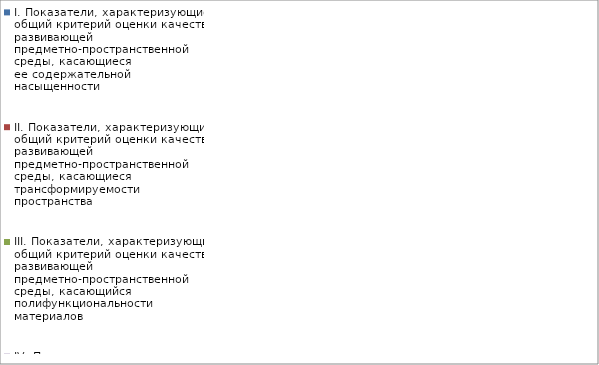
| Category | I. Показатели, характеризующие общий критерий оценки качества развивающей предметно-пространственной среды, касающиеся ее содержательной насыщенности | II. Показатели, характеризующие общий критерий оценки качества развивающей предметно-пространственной среды, касающиеся трансформируемости пространства | III. Показатели, характеризующие общий критерий оценки качества развивающей предметно-пространственной среды, касающийся полифункциональности материалов | IV. Показатели, характеризующие общий критерий оценки качества развивающей предметно-пространственной среды, касающиеся ее вариативности | V. Показатели, характеризующие общий критерий оценки качества развивающей предметно-пространственной среды, касающиеся ее доступности | VI. Показатели, характеризующие общий критерий оценки качества развивающей предметно-пространственной среды, касающиеся безопасности предметно-пространственной среды |
|---|---|---|---|---|---|---|
| АБВГДейка | 0.955 | 0.833 | 0.722 | 0.889 | 1 | 0.95 |